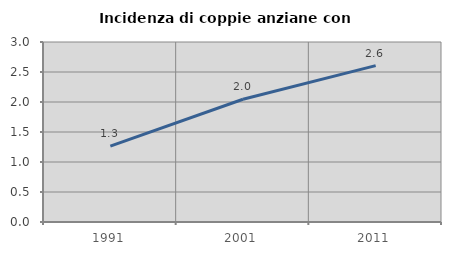
| Category | Incidenza di coppie anziane con figli |
|---|---|
| 1991.0 | 1.266 |
| 2001.0 | 2.045 |
| 2011.0 | 2.607 |